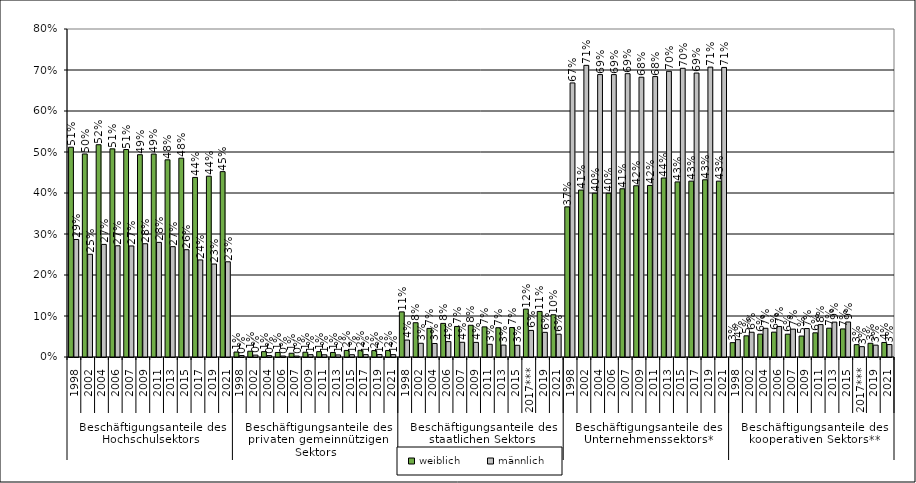
| Category | weiblich | männlich |
|---|---|---|
| 0 | 0.512 | 0.287 |
| 1 | 0.495 | 0.251 |
| 2 | 0.518 | 0.275 |
| 3 | 0.508 | 0.271 |
| 4 | 0.506 | 0.271 |
| 5 | 0.493 | 0.276 |
| 6 | 0.495 | 0.28 |
| 7 | 0.481 | 0.269 |
| 8 | 0.485 | 0.262 |
| 9 | 0.438 | 0.237 |
| 10 | 0.441 | 0.227 |
| 11 | 0.452 | 0.232 |
| 12 | 0.012 | 0.004 |
| 13 | 0.014 | 0.005 |
| 14 | 0.013 | 0.004 |
| 15 | 0.011 | 0.002 |
| 16 | 0.009 | 0.002 |
| 17 | 0.012 | 0.006 |
| 18 | 0.013 | 0.005 |
| 19 | 0.011 | 0.005 |
| 20 | 0.016 | 0.006 |
| 21 | 0.016 | 0.006 |
| 22 | 0.016 | 0.006 |
| 23 | 0.016 | 0.006 |
| 24 | 0.11 | 0.041 |
| 25 | 0.084 | 0.033 |
| 26 | 0.07 | 0.033 |
| 27 | 0.082 | 0.038 |
| 28 | 0.075 | 0.036 |
| 29 | 0.077 | 0.036 |
| 30 | 0.073 | 0.031 |
| 31 | 0.071 | 0.029 |
| 32 | 0.072 | 0.029 |
| 33 | 0.117 | 0.065 |
| 34 | 0.111 | 0.06 |
| 35 | 0.103 | 0.056 |
| 36 | 0.366 | 0.668 |
| 37 | 0.407 | 0.711 |
| 38 | 0.399 | 0.689 |
| 39 | 0.399 | 0.689 |
| 40 | 0.41 | 0.691 |
| 41 | 0.418 | 0.682 |
| 42 | 0.418 | 0.684 |
| 43 | 0.437 | 0.697 |
| 44 | 0.427 | 0.704 |
| 45 | 0.429 | 0.693 |
| 46 | 0.432 | 0.707 |
| 47 | 0.429 | 0.706 |
| 48 | 0.035 | 0.042 |
| 49 | 0.052 | 0.06 |
| 50 | 0.056 | 0.07 |
| 51 | 0.061 | 0.074 |
| 52 | 0.056 | 0.068 |
| 53 | 0.051 | 0.069 |
| 54 | 0.059 | 0.079 |
| 55 | 0.07 | 0.085 |
| 56 | 0.068 | 0.085 |
| 57 | 0.03 | 0.025 |
| 58 | 0.033 | 0.029 |
| 59 | 0.035 | 0.03 |